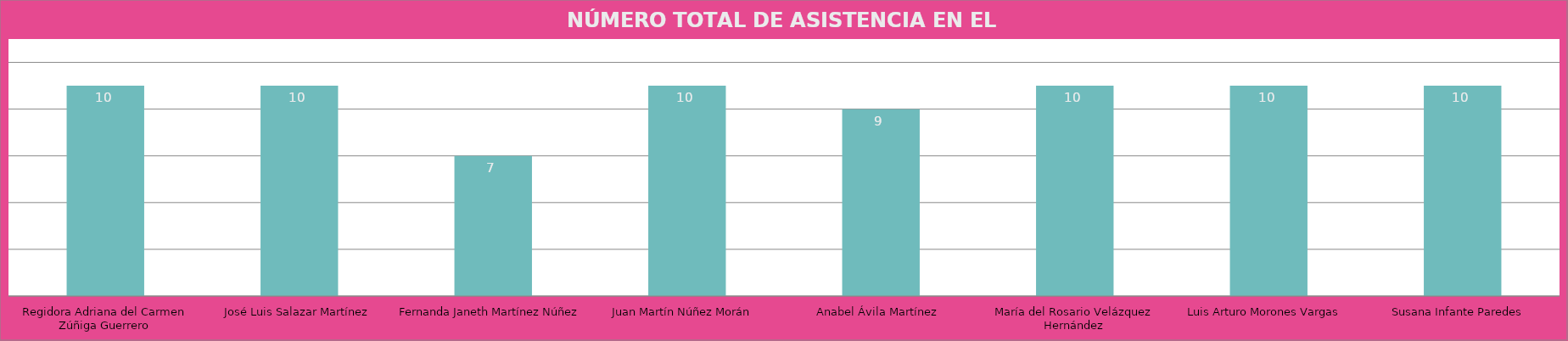
| Category | Regidora Adriana del Carmen Zúñiga Guerrero |
|---|---|
| Regidora Adriana del Carmen Zúñiga Guerrero | 10 |
| José Luis Salazar Martínez | 10 |
| Fernanda Janeth Martínez Núñez | 7 |
| Juan Martín Núñez Morán  | 10 |
| Anabel Ávila Martínez  | 9 |
| María del Rosario Velázquez Hernández | 10 |
| Luis Arturo Morones Vargas  | 10 |
| Susana Infante Paredes  | 10 |